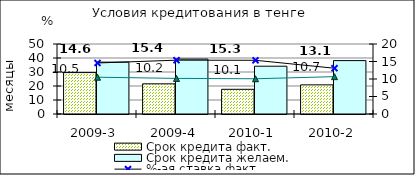
| Category | Срок кредита факт.  | Срок кредита желаем. |
|---|---|---|
| 2009-3 | 29.58 | 37.04 |
| 2009-4 | 21.55 | 39.22 |
| 2010-1 | 17.64 | 34.13 |
| 2010-2 | 20.81 | 38.14 |